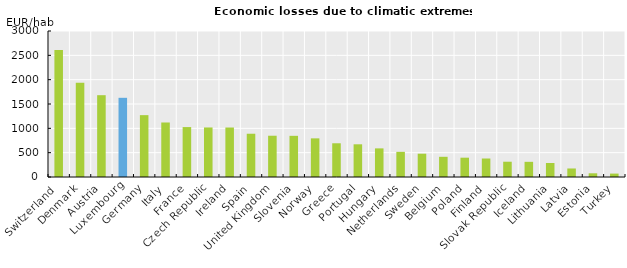
| Category | Loss per habitant |
|---|---|
| Switzerland  | 2609 |
| Denmark | 1936 |
| Austria | 1681 |
| Luxembourg | 1627 |
| Germany | 1271 |
| Italy | 1120 |
| France | 1026 |
| Czech Republic | 1018 |
| Ireland | 1017 |
| Spain | 889 |
| United Kingdom | 848 |
| Slovenia | 846 |
| Norway | 794 |
| Greece | 693 |
| Portugal | 672 |
| Hungary | 588 |
| Netherlands | 517 |
| Sweden | 479 |
| Belgium | 415 |
| Poland | 397 |
| Finland | 380 |
| Slovak Republic | 314 |
| Iceland | 312 |
| Lithuania | 288 |
| Latvia | 175 |
| Estonia | 76 |
| Turkey | 70 |